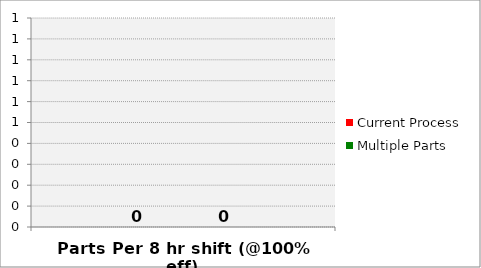
| Category | Current Process | Multiple Parts |
|---|---|---|
| Parts Per 8 hr shift (@100% eff) | 0 | 0 |